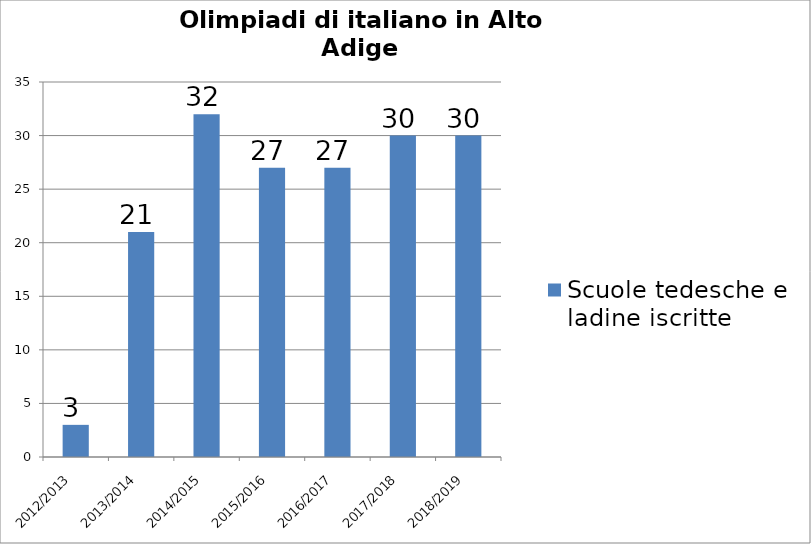
| Category | Scuole tedesche e ladine iscritte |
|---|---|
| 2012/2013 | 3 |
| 2013/2014 | 21 |
| 2014/2015 | 32 |
| 2015/2016 | 27 |
| 2016/2017 | 27 |
| 2017/2018 | 30 |
| 2018/2019 | 30 |